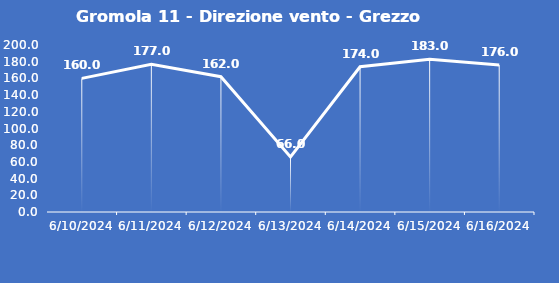
| Category | Gromola 11 - Direzione vento - Grezzo (°N) |
|---|---|
| 6/10/24 | 160 |
| 6/11/24 | 177 |
| 6/12/24 | 162 |
| 6/13/24 | 66 |
| 6/14/24 | 174 |
| 6/15/24 | 183 |
| 6/16/24 | 176 |